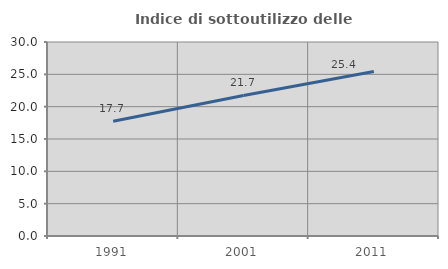
| Category | Indice di sottoutilizzo delle abitazioni  |
|---|---|
| 1991.0 | 17.74 |
| 2001.0 | 21.735 |
| 2011.0 | 25.437 |